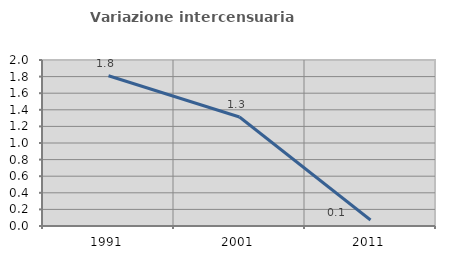
| Category | Variazione intercensuaria annua |
|---|---|
| 1991.0 | 1.81 |
| 2001.0 | 1.313 |
| 2011.0 | 0.073 |